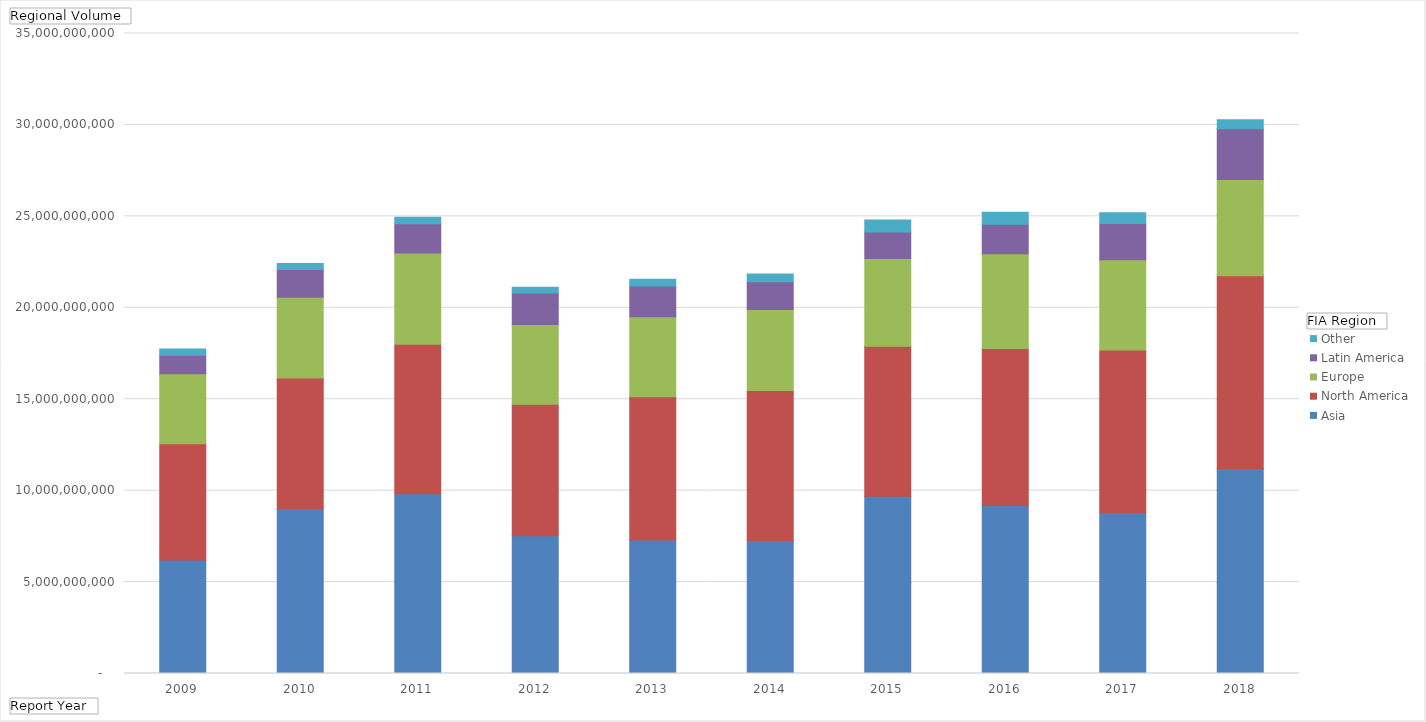
| Category | Asia | North America | Europe | Latin America | Other |
|---|---|---|---|---|---|
| 2009 | 6207410614 | 6353460672 | 3830823740 | 1015510637 | 332693081 |
| 2010 | 8991328884 | 7169764814 | 4416249922 | 1518883227 | 322749043 |
| 2011 | 9825921159 | 8185154112 | 4982199509 | 1603193858 | 349855465 |
| 2012 | 7526386363 | 7204287817 | 4351011162 | 1730633143 | 316835282 |
| 2013 | 7301618146 | 7832002867 | 4372576365 | 1683182524 | 377436245 |
| 2014 | 7257187519 | 8215935876 | 4429997544 | 1516759488 | 433297533 |
| 2015 | 9697458914 | 8198938400 | 4795837387 | 1450744978 | 658103273 |
| 2016 | 9180874700 | 8590060261 | 5179761861 | 1615293377 | 654024124 |
| 2017 | 8809399396 | 8886461065 | 4935945295 | 1971927150 | 595154992 |
| 2018 | 11192572507 | 10559161846 | 5265097175 | 2776523066 | 489142700 |